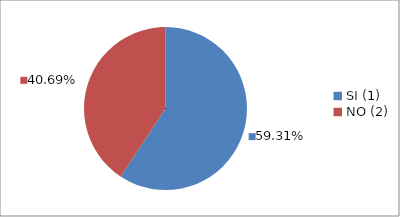
| Category | Series 0 |
|---|---|
| SI (1) | 0.593 |
| NO (2) | 0.407 |